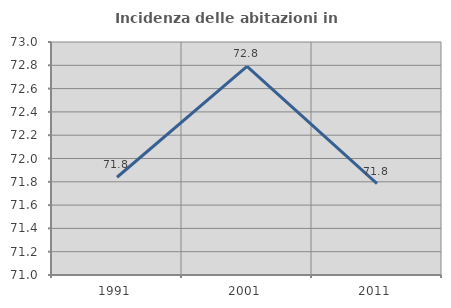
| Category | Incidenza delle abitazioni in proprietà  |
|---|---|
| 1991.0 | 71.839 |
| 2001.0 | 72.79 |
| 2011.0 | 71.785 |